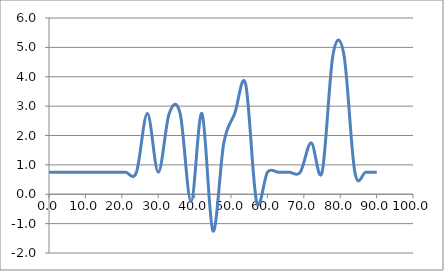
| Category | Elevation (in.) |
|---|---|
| 0.024 | 0.75 |
| 3.024 | 0.75 |
| 6.024 | 0.75 |
| 9.024000000000001 | 0.75 |
| 12.024000000000001 | 0.75 |
| 15.024000000000001 | 0.75 |
| 18.024 | 0.75 |
| 21.024 | 0.75 |
| 24.023999999999997 | 0.75 |
| 27.023999999999997 | 2.75 |
| 30.023999999999997 | 0.75 |
| 33.024 | 2.75 |
| 36.024 | 2.75 |
| 39.024 | -0.25 |
| 42.024 | 2.75 |
| 45.024 | -1.25 |
| 48.024 | 1.75 |
| 51.024 | 2.75 |
| 54.024 | 3.75 |
| 57.024 | -0.25 |
| 60.024 | 0.75 |
| 63.024 | 0.75 |
| 66.024 | 0.75 |
| 69.024 | 0.75 |
| 72.024 | 1.75 |
| 75.024 | 0.75 |
| 78.024 | 4.75 |
| 81.024 | 4.75 |
| 84.024 | 0.75 |
| 87.024 | 0.75 |
| 90.024 | 0.75 |